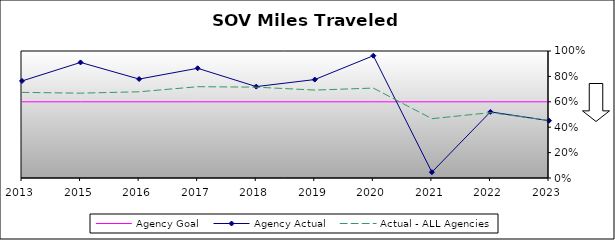
| Category | Agency Goal | Agency Actual | Actual - ALL Agencies |
|---|---|---|---|
| 2013.0 | 0.6 | 0.764 | 0.674 |
| 2015.0 | 0.6 | 0.91 | 0.668 |
| 2016.0 | 0.6 | 0.779 | 0.679 |
| 2017.0 | 0.6 | 0.864 | 0.719 |
| 2018.0 | 0.6 | 0.72 | 0.715 |
| 2019.0 | 0.6 | 0.775 | 0.692 |
| 2020.0 | 0.6 | 0.963 | 0.708 |
| 2021.0 | 0.6 | 0.046 | 0.467 |
| 2022.0 | 0.6 | 0.521 | 0.515 |
| 2023.0 | 0.6 | 0.451 | 0.454 |